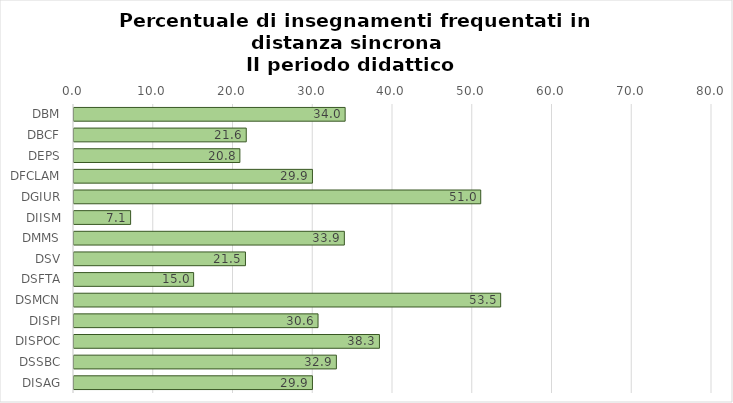
| Category | Series 0 |
|---|---|
| DBM | 34 |
| DBCF | 21.6 |
| DEPS | 20.8 |
| DFCLAM | 29.9 |
| DGIUR | 51 |
| DIISM | 7.1 |
| DMMS | 33.9 |
| DSV | 21.5 |
| DSFTA | 15 |
| DSMCN | 53.5 |
| DISPI | 30.6 |
| DISPOC | 38.3 |
| DSSBC | 32.9 |
| DISAG | 29.9 |